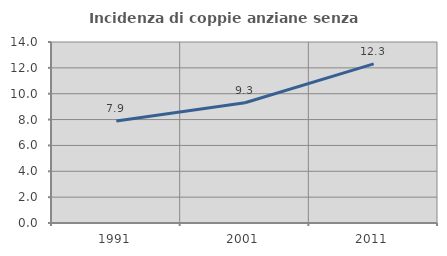
| Category | Incidenza di coppie anziane senza figli  |
|---|---|
| 1991.0 | 7.888 |
| 2001.0 | 9.301 |
| 2011.0 | 12.311 |